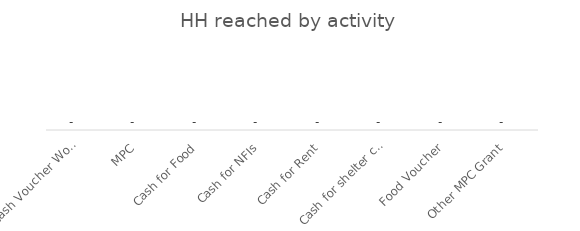
| Category | Series 0 |
|---|---|
| Cash Voucher Working Group | 0 |
| MPC | 0 |
| Cash for Food | 0 |
| Cash for NFIs | 0 |
| Cash for Rent | 0 |
| Cash for shelter construction / repair | 0 |
| Food Voucher | 0 |
| Other MPC Grant | 0 |